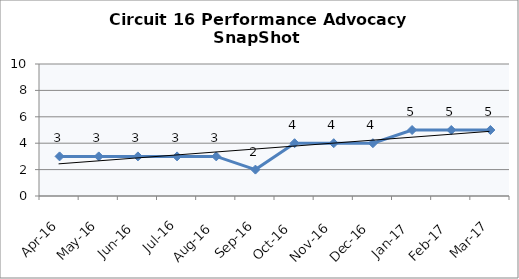
| Category | Circuit 16 |
|---|---|
| Apr-16 | 3 |
| May-16 | 3 |
| Jun-16 | 3 |
| Jul-16 | 3 |
| Aug-16 | 3 |
| Sep-16 | 2 |
| Oct-16 | 4 |
| Nov-16 | 4 |
| Dec-16 | 4 |
| Jan-17 | 5 |
| Feb-17 | 5 |
| Mar-17 | 5 |